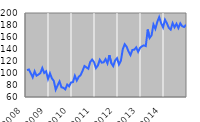
| Category | Series 0 |
|---|---|
| 2008.0 | 104.895 |
| 2.0 | 105.86 |
| 3.0 | 99.463 |
| 4.0 | 92.818 |
| 5.0 | 102.78 |
| 6.0 | 95.513 |
| 7.0 | 97.419 |
| 8.0 | 99.872 |
| 9.0 | 108.363 |
| 10.0 | 100.083 |
| 11.0 | 102.863 |
| 12.0 | 90.07 |
| 2009.0 | 99.513 |
| 2.0 | 91.088 |
| 3.0 | 86.931 |
| 4.0 | 72.252 |
| 5.0 | 79.313 |
| 6.0 | 85.983 |
| 7.0 | 76.231 |
| 8.0 | 75.328 |
| 9.0 | 72.692 |
| 10.0 | 80.716 |
| 11.0 | 77.756 |
| 12.0 | 84.104 |
| 2010.0 | 84.91 |
| 2.0 | 95.381 |
| 3.0 | 87.46 |
| 4.0 | 93.614 |
| 5.0 | 96.485 |
| 6.0 | 103.608 |
| 7.0 | 111.693 |
| 8.0 | 109.43 |
| 9.0 | 107.205 |
| 10.0 | 118.391 |
| 11.0 | 122.33 |
| 12.0 | 118.033 |
| 2011.0 | 108.209 |
| 2.0 | 112.413 |
| 3.0 | 122.056 |
| 4.0 | 117.205 |
| 5.0 | 117.729 |
| 6.0 | 123.098 |
| 7.0 | 115.948 |
| 8.0 | 129.696 |
| 9.0 | 116.398 |
| 10.0 | 111.532 |
| 11.0 | 120.831 |
| 12.0 | 124.75 |
| 2012.0 | 114.21 |
| 2.0 | 120.31 |
| 3.0 | 139.774 |
| 4.0 | 148.02 |
| 5.0 | 143.716 |
| 6.0 | 135.853 |
| 7.0 | 129.889 |
| 8.0 | 138.41 |
| 9.0 | 138.913 |
| 10.0 | 142.744 |
| 11.0 | 135.245 |
| 12.0 | 141.967 |
| 2013.0 | 144.521 |
| 2.0 | 146.042 |
| 3.0 | 144.87 |
| 4.0 | 172.465 |
| 5.0 | 158.473 |
| 6.0 | 162.751 |
| 7.0 | 180.781 |
| 8.0 | 173.607 |
| 9.0 | 185.166 |
| 10.0 | 193.158 |
| 11.0 | 183.138 |
| 12.0 | 176.075 |
| 2014.0 | 188.854 |
| 2.0 | 182.948 |
| 3.0 | 175.321 |
| 4.0 | 172.351 |
| 5.0 | 183.177 |
| 6.0 | 176.158 |
| 7.0 | 182.107 |
| 8.0 | 174.874 |
| 9.0 | 182.754 |
| 10.0 | 178.018 |
| 11.0 | 176.656 |
| 12.0 | 180.447 |